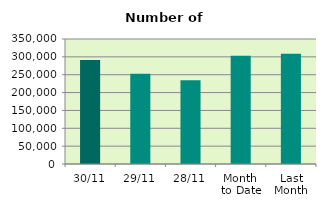
| Category | Series 0 |
|---|---|
| 30/11 | 291108 |
| 29/11 | 252562 |
| 28/11 | 234786 |
| Month 
to Date | 303258.727 |
| Last
Month | 308508.19 |